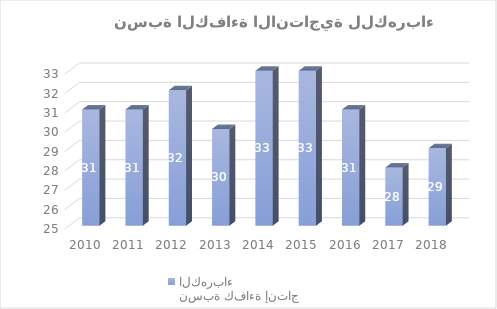
| Category | نسبة كفاءة إنتاج الكهرباء  |
|---|---|
| 2010.0 | 31 |
| 2011.0 | 31 |
| 2012.0 | 32 |
| 2013.0 | 30 |
| 2014.0 | 33 |
| 2015.0 | 33 |
| 2016.0 | 31 |
| 2017.0 | 28 |
| 2018.0 | 29 |